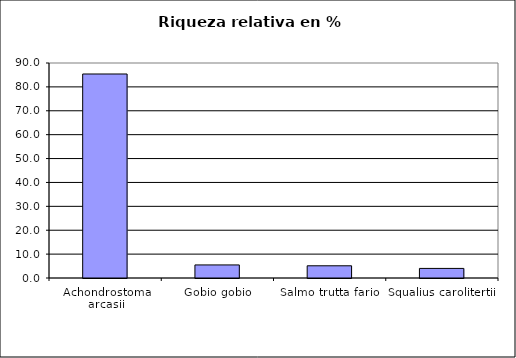
| Category | Series 0 |
|---|---|
| Achondrostoma arcasii | 85.401 |
| Gobio gobio | 5.474 |
| Salmo trutta fario | 5.109 |
| Squalius carolitertii | 4.015 |